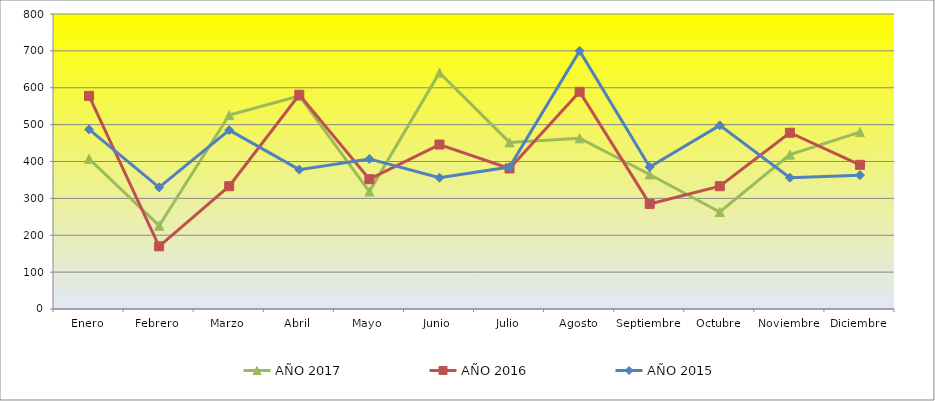
| Category | AÑO 2017 | AÑO 2016 | AÑO 2015 |
|---|---|---|---|
| Enero | 407.407 | 578 | 487 |
| Febrero | 225.926 | 170 | 330 |
| Marzo | 525.926 | 333 | 485 |
| Abril | 577.778 | 581 | 378 |
| Mayo | 318.519 | 352 | 407 |
| Junio | 640.741 | 446 | 356 |
| Julio | 451.852 | 381 | 385 |
| Agosto | 462.963 | 589 | 700 |
| Septiembre | 364.815 | 285 | 385 |
| Octubre | 262.963 | 333 | 498 |
| Noviembre | 418.519 | 478 | 356 |
| Diciembre | 479.63 | 391 | 363 |